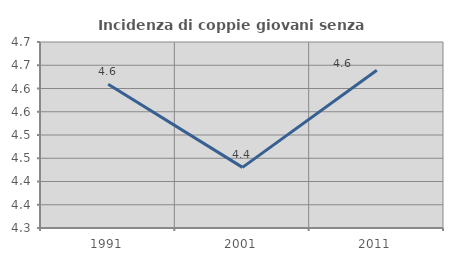
| Category | Incidenza di coppie giovani senza figli |
|---|---|
| 1991.0 | 4.609 |
| 2001.0 | 4.43 |
| 2011.0 | 4.639 |